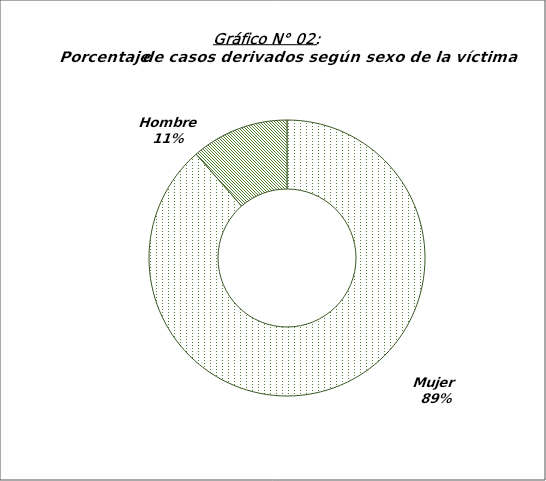
| Category | Series 0 |
|---|---|
| Mujer  | 1952 |
| Hombre | 252 |